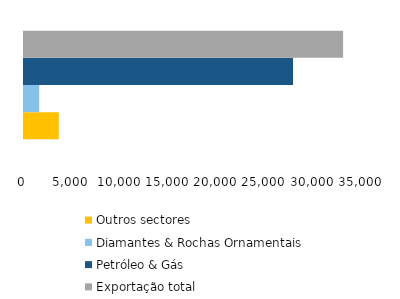
| Category | Outros sectores | Diamantes & Rochas Ornamentais | Petróleo & Gás | Exportação total |
|---|---|---|---|---|
| 2021.0 | 3605.293 | 1575.184 | 27859.859 | 33040.336 |